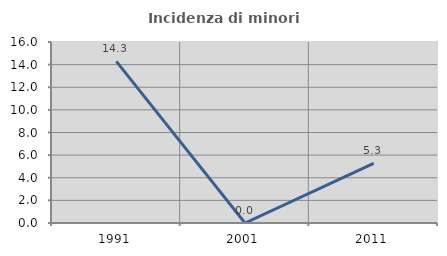
| Category | Incidenza di minori stranieri |
|---|---|
| 1991.0 | 14.286 |
| 2001.0 | 0 |
| 2011.0 | 5.263 |